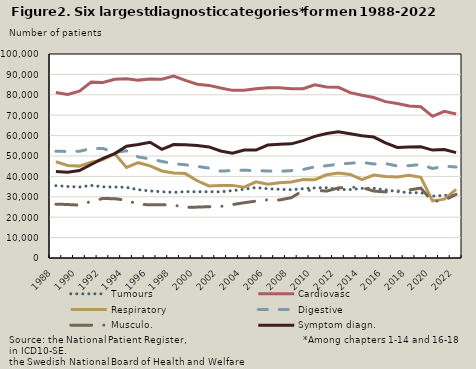
| Category | Tumours | Cardiovasc | Respiratory | Digestive | Musculo. | Symptom diagn.  |
|---|---|---|---|---|---|---|
| 1988.0 | 35460 | 81109 | 47169 | 52332 | 26399 | 42345 |
| 1989.0 | 35062 | 80135 | 45323 | 52228 | 26226 | 42084 |
| 1990.0 | 34793 | 81811 | 45038 | 52308 | 25908 | 42897 |
| 1991.0 | 35583 | 86215 | 47018 | 53686 | 27750 | 45816 |
| 1992.0 | 34879 | 86015 | 48190 | 53663 | 29176 | 48785 |
| 1993.0 | 34796 | 87578 | 51150 | 51714 | 29047 | 51206 |
| 1994.0 | 34623 | 87813 | 44413 | 52561 | 28350 | 54810 |
| 1995.0 | 33485 | 87197 | 46715 | 49527 | 26238 | 55637 |
| 1996.0 | 32872 | 87700 | 45170 | 48581 | 26123 | 56745 |
| 1997.0 | 32473 | 87650 | 42649 | 47345 | 26124 | 53238 |
| 1998.0 | 32154 | 89183 | 41662 | 46265 | 25902 | 55639 |
| 1999.0 | 32537 | 87079 | 41373 | 45678 | 24792 | 55562 |
| 2000.0 | 32481 | 85150 | 37861 | 44895 | 24943 | 55193 |
| 2001.0 | 32498 | 84605 | 35345 | 44068 | 25152 | 54442 |
| 2002.0 | 32444 | 83306 | 35555 | 42577 | 25290 | 52472 |
| 2003.0 | 33029 | 82181 | 35595 | 42885 | 26183 | 51323 |
| 2004.0 | 33736 | 82270 | 34710 | 43043 | 27094 | 52893 |
| 2005.0 | 34541 | 82941 | 37308 | 42792 | 27892 | 52883 |
| 2006.0 | 33935 | 83512 | 36161 | 42677 | 28532 | 55359 |
| 2007.0 | 33664 | 83470 | 36876 | 42451 | 28455 | 55799 |
| 2008.0 | 33465 | 82982 | 37241 | 42846 | 29543 | 55960 |
| 2009.0 | 33978 | 83023 | 38512 | 43366 | 33051 | 57558 |
| 2010.0 | 34358 | 84946 | 38384 | 44691 | 33263 | 59611 |
| 2011.0 | 34447 | 83819 | 40775 | 45222 | 32788 | 61048 |
| 2012.0 | 33610 | 83672 | 41616 | 46035 | 34367 | 61827 |
| 2013.0 | 33530 | 81071 | 40941 | 46444 | 34732 | 60880 |
| 2014.0 | 34137 | 79800 | 38387 | 46867 | 34549 | 59930 |
| 2015.0 | 34190 | 78671 | 40637 | 46118 | 32817 | 59286 |
| 2016.0 | 33390 | 76642 | 39943 | 46304 | 32388 | 56435 |
| 2017.0 | 32592 | 75746 | 39665 | 45111 | 32828 | 54172 |
| 2018.0 | 31998 | 74533 | 40561 | 45269 | 33342 | 54375 |
| 2019.0 | 31995 | 74112 | 39570 | 45836 | 34249 | 54545 |
| 2020.0 | 30343 | 69443 | 28001 | 43852 | 27684 | 52901 |
| 2021.0 | 30687 | 71915 | 28851 | 45007 | 28279 | 53170 |
| 2022.0 | 30967 | 70621 | 33608 | 44616 | 31178 | 51667 |